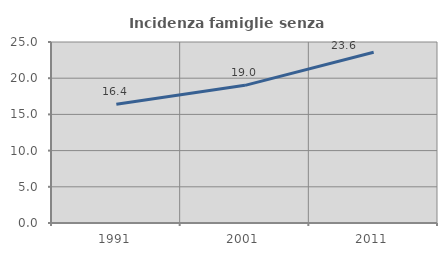
| Category | Incidenza famiglie senza nuclei |
|---|---|
| 1991.0 | 16.411 |
| 2001.0 | 19.013 |
| 2011.0 | 23.578 |